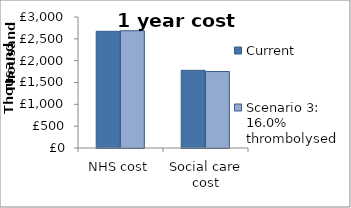
| Category | Current  | Scenario 3: 16.0% thrombolysed |
|---|---|---|
| NHS cost | 2672500 | 2685600 |
| Social care cost | 1778600 | 1751200 |